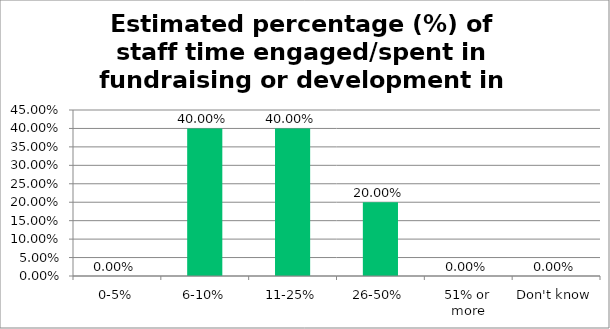
| Category | Responses |
|---|---|
| 0-5% | 0 |
| 6-10% | 0.4 |
| 11-25% | 0.4 |
| 26-50% | 0.2 |
| 51% or more | 0 |
| Don't know | 0 |